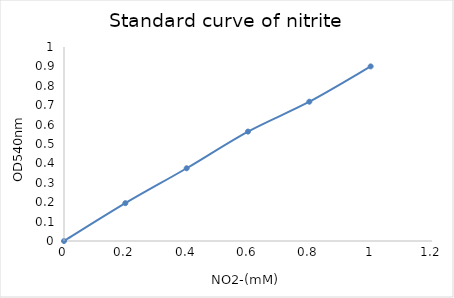
| Category | Series 0 |
|---|---|
| 0.0 | 0 |
| 0.2 | 0.195 |
| 0.4 | 0.375 |
| 0.6 | 0.564 |
| 0.8 | 0.718 |
| 1.0 | 0.9 |